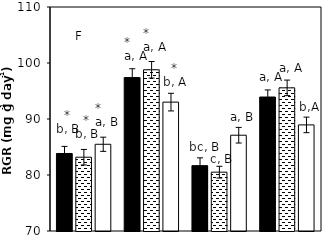
| Category |    A. brasilense |    A. chroococcum |    CK |
|---|---|---|---|
| aCO2-Bt | 83.841 | 83.176 | 85.486 |
| aCO2-XIANYU | 97.398 | 98.79 | 93.013 |
| eCO2-Bt | 81.67 | 80.505 | 87.104 |
| eCO2-XIANYU | 93.923 | 95.561 | 88.945 |